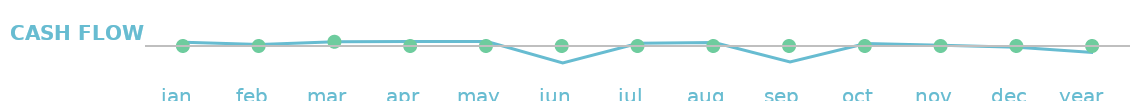
| Category | Cash Flow |
|---|---|
| jan  | 169 |
| feb  | 69 |
| mar  | 192 |
| apr  | 199 |
| may  | 204 |
| jun  | -771 |
| jul  | 124 |
| aug  | 154 |
| sep  | -721 |
| oct  | 109 |
| nov  | 34 |
| dec  | -61 |
| year   | -299 |